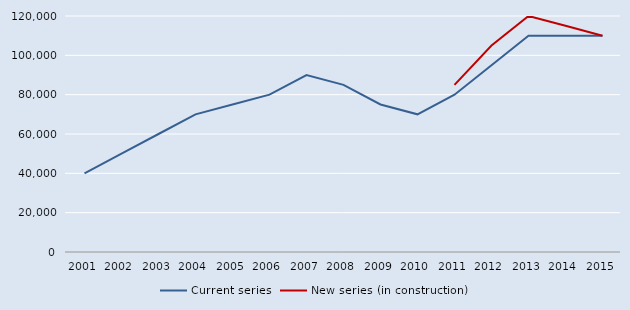
| Category | Current series | New series (in construction) |
|---|---|---|
| 2001.0 | 40000 | 0 |
| 2002.0 | 50000 | 0 |
| 2003.0 | 60000 | 0 |
| 2004.0 | 70000 | 0 |
| 2005.0 | 75000 | 0 |
| 2006.0 | 80000 | 0 |
| 2007.0 | 90000 | 0 |
| 2008.0 | 85000 | 0 |
| 2009.0 | 75000 | 0 |
| 2010.0 | 70000 | 0 |
| 2011.0 | 80000 | 85000 |
| 2012.0 | 95000 | 105000 |
| 2013.0 | 110000 | 120000 |
| 2014.0 | 110000 | 115000 |
| 2015.0 | 110000 | 110000 |